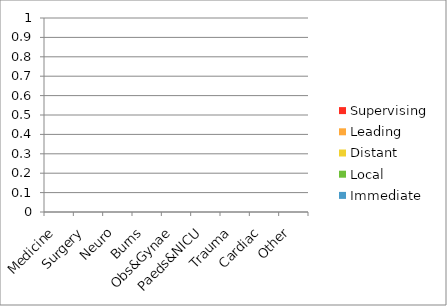
| Category | Immediate | Local | Distant | Leading | Supervising |
|---|---|---|---|---|---|
| Medicine | 0 | 0 | 0 | 0 | 0 |
| Surgery | 0 | 0 | 0 | 0 | 0 |
| Neuro | 0 | 0 | 0 | 0 | 0 |
| Burns | 0 | 0 | 0 | 0 | 0 |
| Obs&Gynae | 0 | 0 | 0 | 0 | 0 |
| Paeds&NICU | 0 | 0 | 0 | 0 | 0 |
| Trauma | 0 | 0 | 0 | 0 | 0 |
| Cardiac | 0 | 0 | 0 | 0 | 0 |
| Other | 0 | 0 | 0 | 0 | 0 |